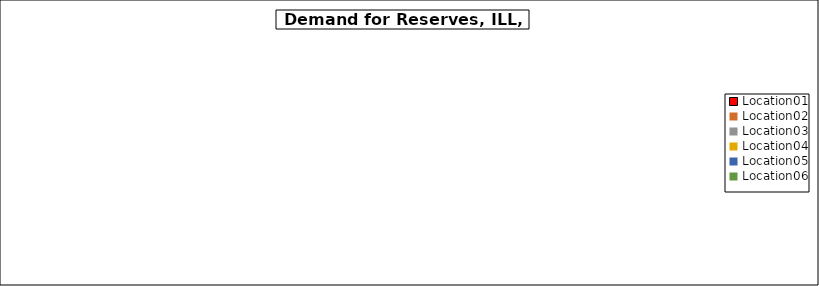
| Category | Data A |
|---|---|
| Location01 | 0 |
| Location02 | 0 |
| Location03 | 0 |
| Location04 | 0 |
| Location05 | 0 |
| Location06 | 0 |